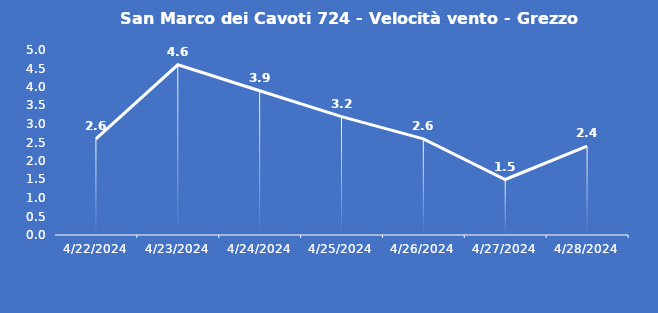
| Category | San Marco dei Cavoti 724 - Velocità vento - Grezzo (m/s) |
|---|---|
| 4/22/24 | 2.6 |
| 4/23/24 | 4.6 |
| 4/24/24 | 3.9 |
| 4/25/24 | 3.2 |
| 4/26/24 | 2.6 |
| 4/27/24 | 1.5 |
| 4/28/24 | 2.4 |